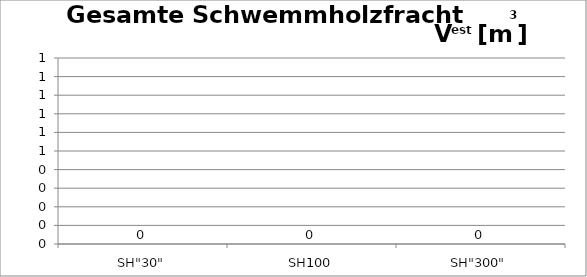
| Category | Schwemmholzfracht |
|---|---|
| SH"30" | 0 |
| SH100 | 0 |
| SH"300" | 0 |